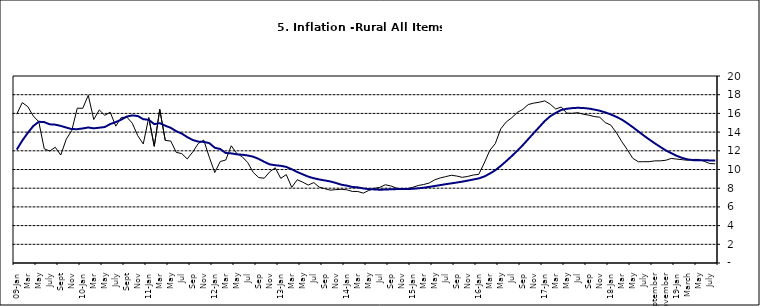
| Category | Series 0 | Series 1 |
|---|---|---|
| 09-Jan | 15.918 | 12.128 |
| Feb | 17.154 | 13.086 |
| Mar | 16.729 | 13.912 |
| Apr | 15.727 | 14.644 |
| May | 15.113 | 15.104 |
| June | 12.213 | 15.067 |
| July | 11.974 | 14.832 |
| Aug | 12.38 | 14.796 |
| Sept | 11.548 | 14.661 |
| Oct | 13.242 | 14.488 |
| Nov | 14.164 | 14.321 |
|  | 16.557 | 14.316 |
| 10-Jan | 16.548 | 14.39 |
| Feb | 17.934 | 14.494 |
| Mar | 15.346 | 14.401 |
| Apr | 16.373 | 14.473 |
| May | 15.794 | 14.54 |
| June | 16.126 | 14.862 |
| July | 14.634 | 15.072 |
| Aug | 15.556 | 15.33 |
| Sept | 15.616 | 15.658 |
| Oct | 14.955 | 15.786 |
| Nov | 13.616 | 15.719 |
| Dec | 12.735 | 15.385 |
| 11-Jan | 15.553 | 15.311 |
| Feb | 12.482 | 14.856 |
| Mar | 16.422 | 14.956 |
| Apr | 13.117 | 14.687 |
| May | 13.041 | 14.457 |
| Jun | 11.83 | 14.095 |
| Jul | 11.699 | 13.84 |
| Aug | 11.13 | 13.464 |
| Sep | 11.878 | 13.156 |
| Oct | 12.778 | 12.985 |
| Nov | 13.147 | 12.95 |
| Dec | 11.326 | 12.824 |
| 12-Jan | 9.678 | 12.33 |
| Feb | 10.856 | 12.188 |
| Mar | 11.014 | 11.76 |
| Apr | 12.536 | 11.724 |
| May | 11.712 | 11.621 |
| Jun | 11.36 | 11.582 |
| Jul | 10.733 | 11.499 |
| Aug | 9.683 | 11.368 |
| Sep | 9.132 | 11.131 |
| Oct | 9.071 | 10.82 |
| Nov | 9.758 | 10.548 |
| Dec | 10.183 | 10.455 |
| 13-Jan | 9.052 | 10.394 |
| Feb | 9.457 | 10.276 |
| Mar | 8.091 | 10.025 |
| Apr | 8.907 | 9.732 |
| May | 8.647 | 9.483 |
| Jun | 8.333 | 9.236 |
| Jul | 8.6 | 9.063 |
| Aug | 8.12 | 8.933 |
| Sep | 7.95 | 8.832 |
| Oct | 7.791 | 8.722 |
| Nov | 7.849 | 8.565 |
| Dec | 7.879 | 8.378 |
| 14-Jan | 7.832 | 8.277 |
| Feb | 7.657 | 8.13 |
| Mar | 7.65 | 8.092 |
| Apr | 7.473 | 7.973 |
| May | 7.761 | 7.901 |
| Jun | 7.98 | 7.874 |
| Jul | 8.086 | 7.834 |
| Aug | 8.368 | 7.858 |
| Sep | 8.244 | 7.883 |
| Oct | 8.019 | 7.903 |
| Nov | 7.898 | 7.906 |
| Dec | 7.955 | 7.913 |
| 15-Jan | 8.094 | 7.935 |
| Feb | 8.291 | 7.988 |
| Mar | 8.396 | 8.05 |
| Apr | 8.556 | 8.14 |
| May | 8.896 | 8.236 |
| Jun | 9.098 | 8.331 |
| Jul | 9.238 | 8.429 |
| Aug | 9.382 | 8.516 |
| Sep | 9.3 | 8.606 |
| Oct | 9.162 | 8.7 |
| Nov | 9.261 | 8.813 |
| Dec | 9.41 | 8.933 |
| 16-Jan | 9.48 | 9.047 |
| Feb | 10.692 | 9.249 |
| Mar | 12.038 | 9.559 |
| Apr | 12.767 | 9.917 |
| May | 14.349 | 10.384 |
| Jun | 15.088 | 10.897 |
| Jul | 15.533 | 11.433 |
| Aug | 16.103 | 12.002 |
| Sep | 16.428 | 12.601 |
| Oct | 16.947 | 13.25 |
| Nov | 17.099 | 13.898 |
| Dec | 17.195 | 14.54 |
| 17-Jan | 17.341 | 15.183 |
| Feb | 16.982 | 15.696 |
| Mar | 16.466 | 16.054 |
| Apr | 16.687 | 16.369 |
| May | 16.023 | 16.497 |
| Jun | 16.007 | 16.563 |
| Jul | 16.078 | 16.6 |
| Aug | 15.914 | 16.577 |
| Sep | 15.812 | 16.52 |
| Oct | 15.666 | 16.411 |
| Nov | 15.587 | 16.285 |
| Dec | 15.018 | 16.104 |
| 18-Jan | 14.756 | 15.892 |
| Feb | 13.957 | 15.638 |
| Mar | 12.987 | 15.339 |
| Apr | 12.126 | 14.95 |
| May | 11.199 | 14.53 |
| June | 10.832 | 14.083 |
| July | 10.831 | 13.636 |
| August | 10.838 | 13.209 |
| September | 10.924 | 12.804 |
| October | 10.927 | 12.418 |
| November | 10.986 | 12.049 |
| December | 11.183 | 11.746 |
| 19-Jan | 11.115 | 11.462 |
| February | 11.048 | 11.234 |
| March | 10.99 | 11.078 |
| April | 11.08 | 10.997 |
| May | 11.075 | 10.988 |
| June | 10.874 | 10.99 |
| July | 10.636 | 10.972 |
| August | 10.609 | 10.951 |